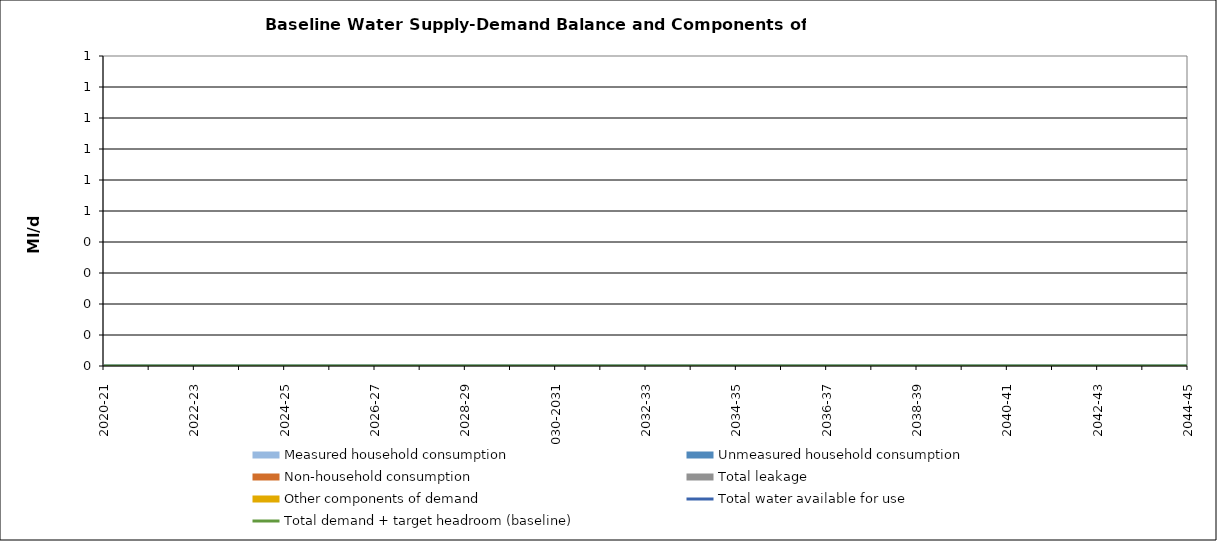
| Category | Total water available for use | Total demand + target headroom (baseline) |
|---|---|---|
| 0 | 0 | 0 |
| 1 | 0 | 0 |
| 2 | 0 | 0 |
| 3 | 0 | 0 |
| 4 | 0 | 0 |
| 5 | 0 | 0 |
| 6 | 0 | 0 |
| 7 | 0 | 0 |
| 8 | 0 | 0 |
| 9 | 0 | 0 |
| 10 | 0 | 0 |
| 11 | 0 | 0 |
| 12 | 0 | 0 |
| 13 | 0 | 0 |
| 14 | 0 | 0 |
| 15 | 0 | 0 |
| 16 | 0 | 0 |
| 17 | 0 | 0 |
| 18 | 0 | 0 |
| 19 | 0 | 0 |
| 20 | 0 | 0 |
| 21 | 0 | 0 |
| 22 | 0 | 0 |
| 23 | 0 | 0 |
| 24 | 0 | 0 |